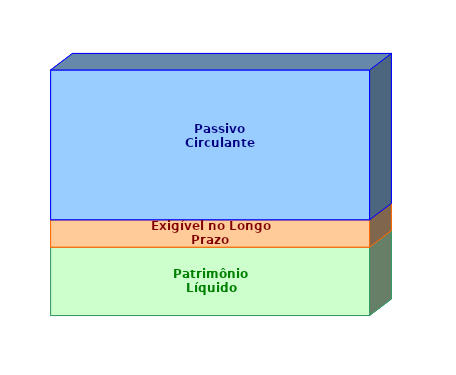
| Category | Patrimônio Líquido | Exigível no Longo Prazo | Passivo Circulante |
|---|---|---|---|
| 0 | 0.279 | 0.111 | 0.61 |